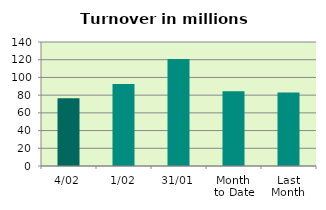
| Category | Series 0 |
|---|---|
| 4/02 | 76.472 |
| 1/02 | 92.481 |
| 31/01 | 120.81 |
| Month 
to Date | 84.477 |
| Last
Month | 82.868 |